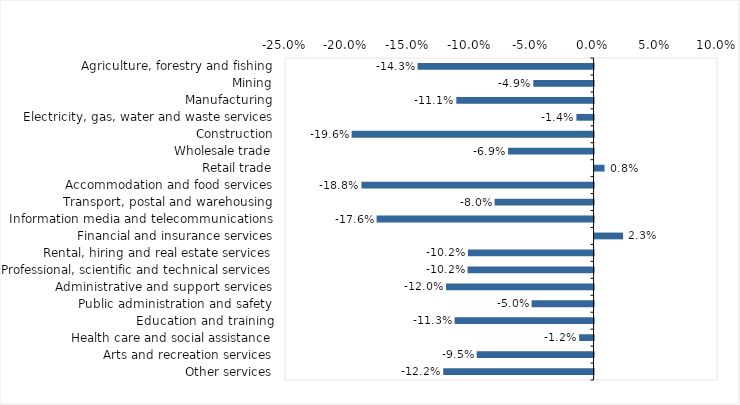
| Category | This week |
|---|---|
| Agriculture, forestry and fishing | -0.143 |
| Mining | -0.049 |
| Manufacturing | -0.111 |
| Electricity, gas, water and waste services | -0.014 |
| Construction | -0.196 |
| Wholesale trade | -0.069 |
| Retail trade | 0.008 |
| Accommodation and food services | -0.188 |
| Transport, postal and warehousing | -0.08 |
| Information media and telecommunications | -0.176 |
| Financial and insurance services | 0.023 |
| Rental, hiring and real estate services | -0.102 |
| Professional, scientific and technical services | -0.102 |
| Administrative and support services | -0.12 |
| Public administration and safety | -0.05 |
| Education and training | -0.113 |
| Health care and social assistance | -0.012 |
| Arts and recreation services | -0.095 |
| Other services | -0.122 |